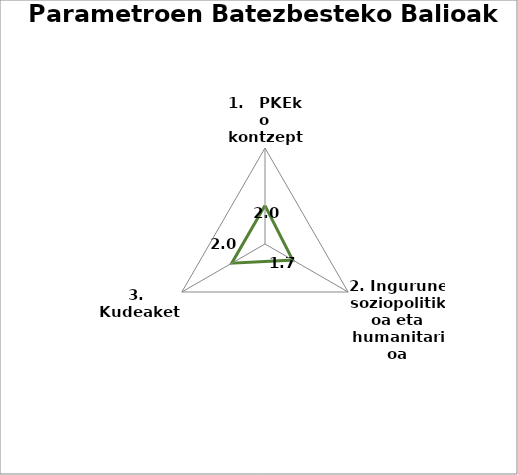
| Category | Series 0 |
|---|---|
| 1.   PKEko kontzeptu integratua | 2 |
| 2. Ingurune soziopolitikoa eta humanitarioa | 1.667 |
| 3.  Kudeaketa | 2 |